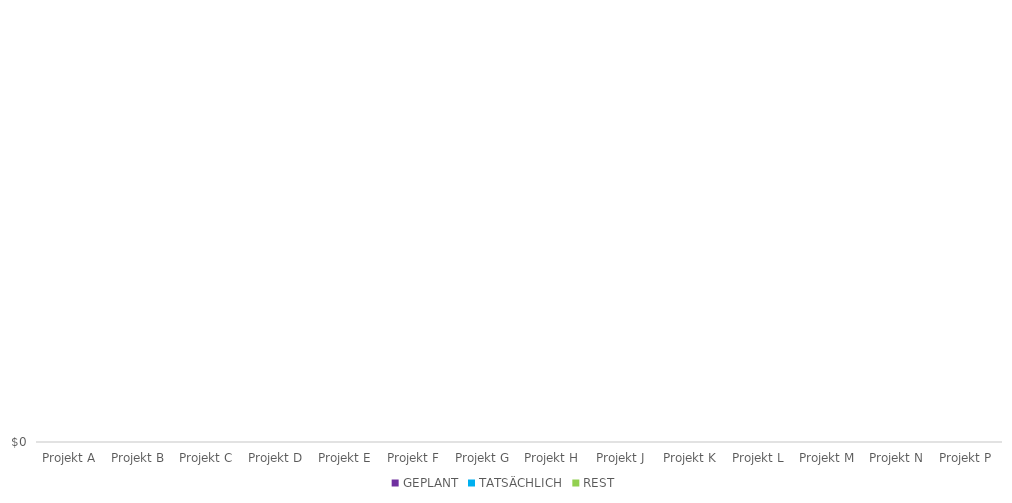
| Category | GEPLANT | TATSÄCHLICH | REST |
|---|---|---|---|
| Projekt A |  |  | 0 |
| Projekt B |  |  | 0 |
| Projekt C |  |  | 0 |
| Projekt D |  |  | 0 |
| Projekt E |  |  | 0 |
| Projekt F |  |  | 0 |
| Projekt G |  |  | 0 |
| Projekt H |  |  | 0 |
| Projekt J |  |  | 0 |
| Projekt K |  |  | 0 |
| Projekt L |  |  | 0 |
| Projekt M |  |  | 0 |
| Projekt N |  |  | 0 |
| Projekt P |  |  | 0 |